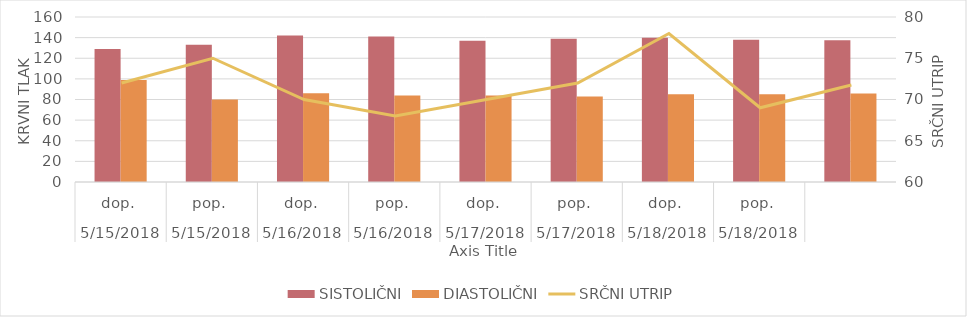
| Category | SISTOLIČNI | DIASTOLIČNI |
|---|---|---|
| 0 | 129 | 99 |
| 1/1/00 | 133 | 80 |
| 1/2/00 | 142 | 86 |
| 1/3/00 | 141 | 84 |
| 1/4/00 | 137 | 84 |
| 1/5/00 | 139 | 83 |
| 1/6/00 | 140 | 85 |
| 1/7/00 | 138 | 85 |